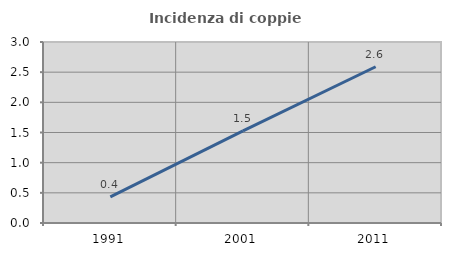
| Category | Incidenza di coppie miste |
|---|---|
| 1991.0 | 0.434 |
| 2001.0 | 1.526 |
| 2011.0 | 2.59 |